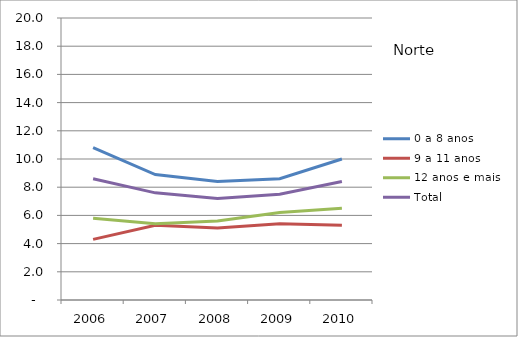
| Category | 0 a 8 anos | 9 a 11 anos | 12 anos e mais | Total |
|---|---|---|---|---|
| 2006.0 | 10.8 | 4.3 | 5.8 | 8.6 |
| 2007.0 | 8.9 | 5.3 | 5.4 | 7.6 |
| 2008.0 | 8.4 | 5.1 | 5.6 | 7.2 |
| 2009.0 | 8.6 | 5.4 | 6.2 | 7.5 |
| 2010.0 | 10 | 5.3 | 6.5 | 8.4 |